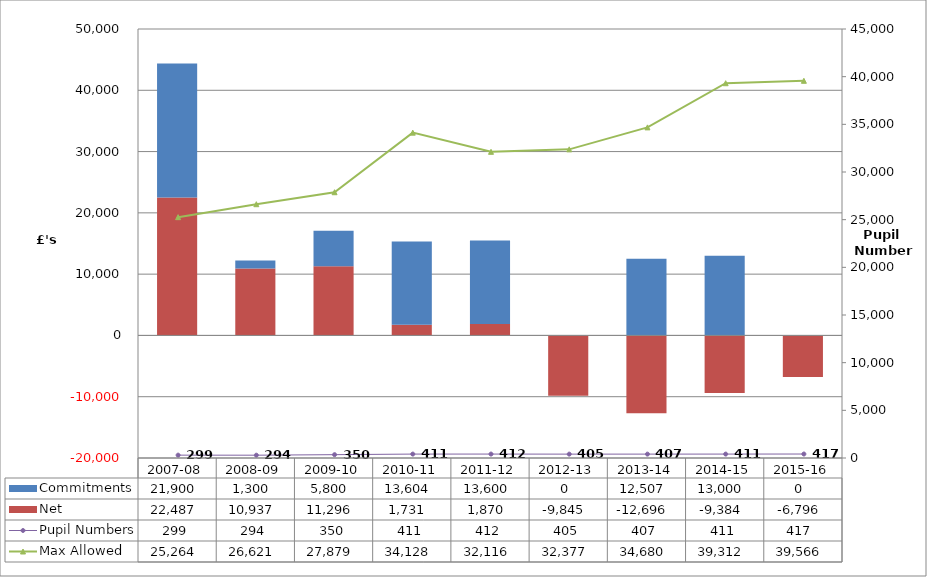
| Category | Net | Commitments |
|---|---|---|
| 2007-08 | 22487 | 21900 |
| 2008-09 | 10937 | 1300 |
| 2009-10 | 11296 | 5800 |
| 2010-11 | 1731 | 13604 |
| 2011-12 | 1870 | 13600 |
| 2012-13 | -9845 | 0 |
| 2013-14 | -12696 | 12507 |
| 2014-15 | -9384 | 13000 |
| 2015-16 | -6796 | 0 |